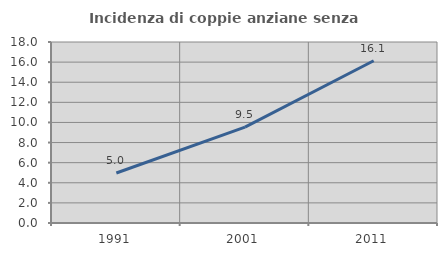
| Category | Incidenza di coppie anziane senza figli  |
|---|---|
| 1991.0 | 4.97 |
| 2001.0 | 9.534 |
| 2011.0 | 16.132 |